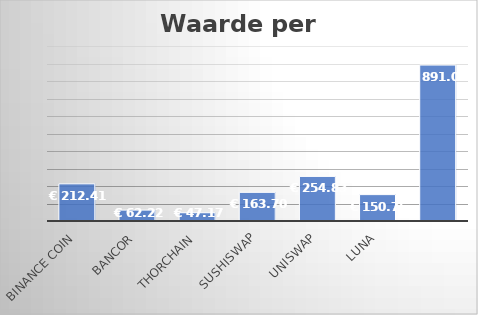
| Category | Series 0 |
|---|---|
| Binance Coin | 212.41 |
| Bancor | 62.216 |
| THORChain | 47.167 |
| SushiSwap | 163.696 |
| UNISWAP | 254.834 |
| Luna | 150.748 |